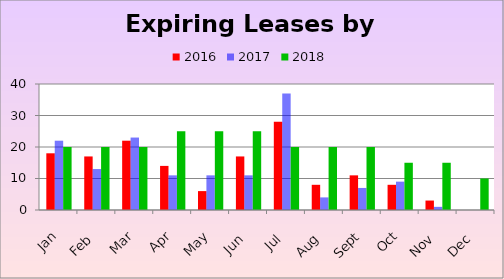
| Category | 2016 | 2017 | 2018 |
|---|---|---|---|
| 2010-01-20 | 18 | 22 | 20 |
| 2010-02-20 | 17 | 13 | 20 |
| 2010-03-20 | 22 | 23 | 20 |
| 2010-04-20 | 14 | 11 | 25 |
| 2010-05-20 | 6 | 11 | 25 |
| 2010-06-20 | 17 | 11 | 25 |
| 2010-07-20 | 28 | 37 | 20 |
| 2010-08-20 | 8 | 4 | 20 |
| 2010-09-20 | 11 | 7 | 20 |
| 2010-10-20 | 8 | 9 | 15 |
| 2010-11-20 | 3 | 1 | 15 |
| 2010-12-20 | 0 | 0 | 10 |